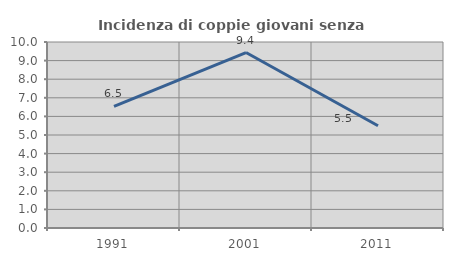
| Category | Incidenza di coppie giovani senza figli |
|---|---|
| 1991.0 | 6.544 |
| 2001.0 | 9.432 |
| 2011.0 | 5.496 |